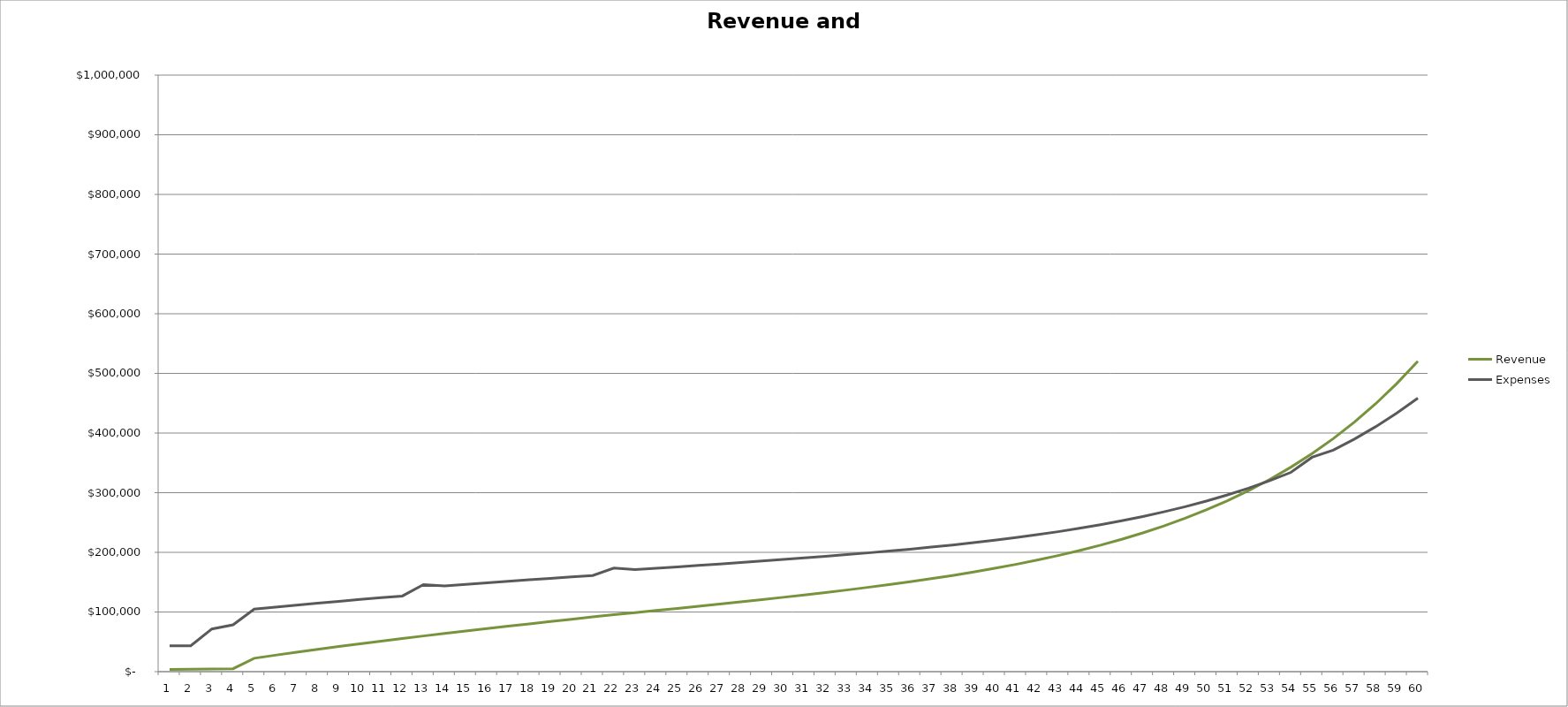
| Category | Revenue | Expenses |
|---|---|---|
| 0 | 3613.264 | 43196.922 |
| 1 | 3941.392 | 43462.182 |
| 2 | 4353.52 | 71588.582 |
| 3 | 4916.858 | 78426.842 |
| 4 | 22465.296 | 104815.487 |
| 5 | 27610.359 | 108217.482 |
| 6 | 32527.912 | 111544.967 |
| 7 | 37320.3 | 114765.015 |
| 8 | 42060.449 | 117928.94 |
| 9 | 46633.08 | 120957.52 |
| 10 | 51119.976 | 123908.886 |
| 11 | 55502.594 | 126769.003 |
| 12 | 59824.801 | 145942.527 |
| 13 | 64042.795 | 143666.417 |
| 14 | 68207.001 | 146339.838 |
| 15 | 72258.875 | 148921.435 |
| 16 | 76246.805 | 151454.224 |
| 17 | 80152.618 | 153916.765 |
| 18 | 84038.796 | 156354.724 |
| 19 | 87942.017 | 158792.878 |
| 20 | 91813.044 | 161197.192 |
| 21 | 95410.323 | 173684.614 |
| 22 | 98956.108 | 171022.098 |
| 23 | 102540.586 | 173387.739 |
| 24 | 106076.795 | 175722.253 |
| 25 | 109691.739 | 178111.182 |
| 26 | 113355.003 | 180534.809 |
| 27 | 117045.553 | 182976.687 |
| 28 | 120825.146 | 185479.958 |
| 29 | 124636.118 | 188004.162 |
| 30 | 128606.224 | 190638.626 |
| 31 | 132649.195 | 193321.198 |
| 32 | 136866.657 | 196121.241 |
| 33 | 141296.583 | 199066.845 |
| 34 | 145845.604 | 202090.854 |
| 35 | 150689.772 | 205314.687 |
| 36 | 155839.097 | 208745.164 |
| 37 | 161231.15 | 212338.387 |
| 38 | 167015.645 | 216195.633 |
| 39 | 173203.742 | 220324.468 |
| 40 | 179807.039 | 224732.743 |
| 41 | 186985.404 | 229528.772 |
| 42 | 194641.198 | 234645.529 |
| 43 | 203020.557 | 240251.657 |
| 44 | 212014.122 | 246268.561 |
| 45 | 221875.909 | 252870.317 |
| 46 | 232631.087 | 260074.066 |
| 47 | 244340.299 | 267920.089 |
| 48 | 257190.269 | 276535.219 |
| 49 | 271249.18 | 285964.896 |
| 50 | 286586.533 | 296255.428 |
| 51 | 303568.877 | 307656.036 |
| 52 | 322245.566 | 320200.419 |
| 53 | 342805.84 | 334013.524 |
| 54 | 365506.974 | 359391.087 |
| 55 | 390589.032 | 371258.453 |
| 56 | 418297.381 | 389899.508 |
| 57 | 448923.11 | 410511.709 |
| 58 | 482803.559 | 433323.103 |
| 59 | 520366.492 | 458626.532 |